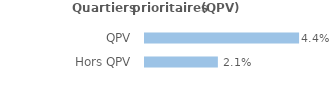
| Category | Series 0 |
|---|---|
| QPV | 0.044 |
| Hors QPV | 0.021 |